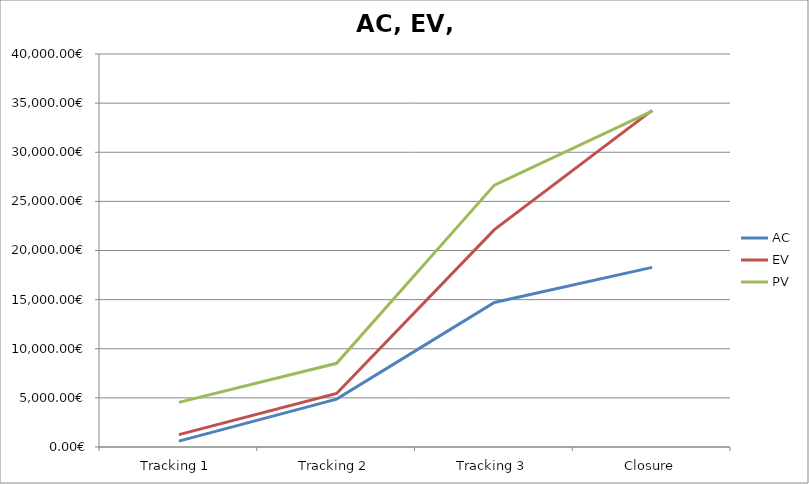
| Category | AC | EV | PV |
|---|---|---|---|
| Tracking 1 | 600 | 1263 | 4545 |
| Tracking 2 | 4875 | 5451 | 8520 |
| Tracking 3 | 14715 | 22125.15 | 26655 |
| Closure | 18285 | 34260 | 34185 |